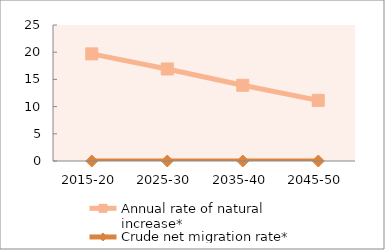
| Category | Annual rate of natural increase* | Crude net migration rate* |
|---|---|---|
| 2015-20 | 19.694 | 0 |
| 2025-30 | 16.914 | 0 |
| 2035-40 | 13.923 | 0 |
| 2045-50 | 11.145 | 0 |